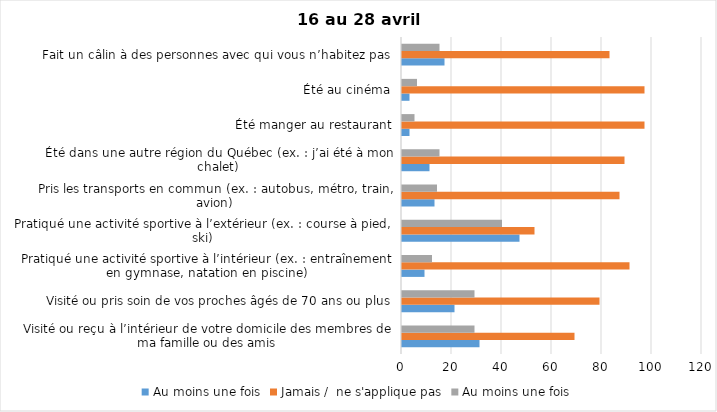
| Category | Au moins une fois | Jamais /  ne s'applique pas |
|---|---|---|
| Visité ou reçu à l’intérieur de votre domicile des membres de ma famille ou des amis | 29 | 69 |
| Visité ou pris soin de vos proches âgés de 70 ans ou plus | 29 | 79 |
| Pratiqué une activité sportive à l’intérieur (ex. : entraînement en gymnase, natation en piscine) | 12 | 91 |
| Pratiqué une activité sportive à l’extérieur (ex. : course à pied, ski) | 40 | 53 |
| Pris les transports en commun (ex. : autobus, métro, train, avion) | 14 | 87 |
| Été dans une autre région du Québec (ex. : j’ai été à mon chalet) | 15 | 89 |
| Été manger au restaurant | 5 | 97 |
| Été au cinéma | 6 | 97 |
| Fait un câlin à des personnes avec qui vous n’habitez pas | 15 | 83 |